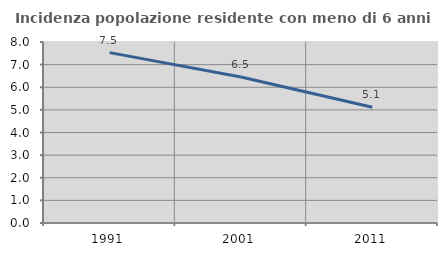
| Category | Incidenza popolazione residente con meno di 6 anni |
|---|---|
| 1991.0 | 7.531 |
| 2001.0 | 6.452 |
| 2011.0 | 5.117 |